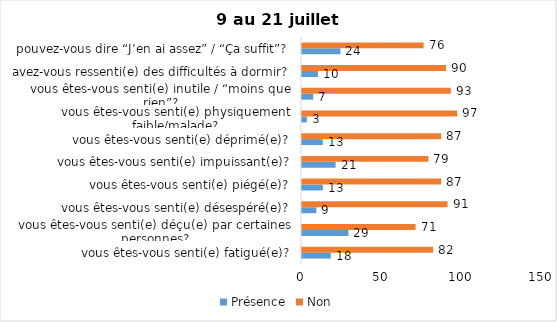
| Category | Présence | Non |
|---|---|---|
| vous êtes-vous senti(e) fatigué(e)? | 18 | 82 |
| vous êtes-vous senti(e) déçu(e) par certaines personnes? | 29 | 71 |
| vous êtes-vous senti(e) désespéré(e)? | 9 | 91 |
| vous êtes-vous senti(e) piégé(e)? | 13 | 87 |
| vous êtes-vous senti(e) impuissant(e)? | 21 | 79 |
| vous êtes-vous senti(e) déprimé(e)? | 13 | 87 |
| vous êtes-vous senti(e) physiquement faible/malade? | 3 | 97 |
| vous êtes-vous senti(e) inutile / “moins que rien”? | 7 | 93 |
| avez-vous ressenti(e) des difficultés à dormir? | 10 | 90 |
| pouvez-vous dire “J’en ai assez” / “Ça suffit”? | 24 | 76 |